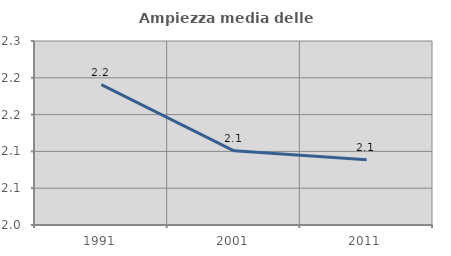
| Category | Ampiezza media delle famiglie |
|---|---|
| 1991.0 | 2.191 |
| 2001.0 | 2.101 |
| 2011.0 | 2.089 |